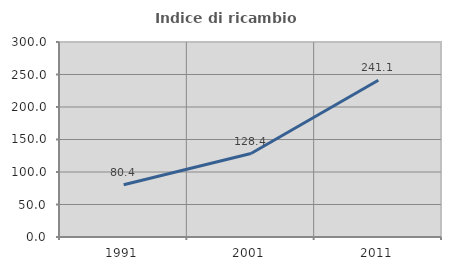
| Category | Indice di ricambio occupazionale  |
|---|---|
| 1991.0 | 80.422 |
| 2001.0 | 128.429 |
| 2011.0 | 241.144 |